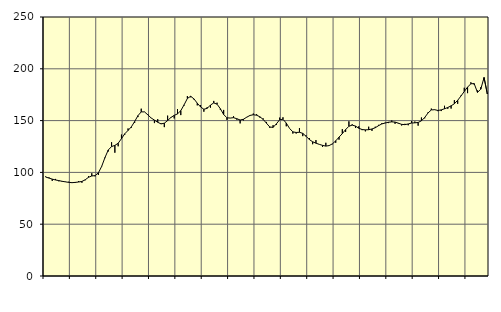
| Category | Piggar | Series 1 |
|---|---|---|
| nan | 96.1 | 95.5 |
| 87.0 | 95.2 | 94.53 |
| 87.0 | 91.8 | 93.51 |
| 87.0 | 93.7 | 92.68 |
| nan | 91.4 | 92.09 |
| 88.0 | 91 | 91.41 |
| 88.0 | 91.1 | 90.87 |
| 88.0 | 91 | 90.38 |
| nan | 90.3 | 90.08 |
| 89.0 | 89.8 | 90.36 |
| 89.0 | 91.6 | 90.73 |
| 89.0 | 90 | 91.27 |
| nan | 92.4 | 92.88 |
| 90.0 | 96.4 | 95.27 |
| 90.0 | 99.2 | 96.56 |
| 90.0 | 96.2 | 96.9 |
| nan | 97.5 | 99.55 |
| 91.0 | 106.2 | 105.83 |
| 91.0 | 113.8 | 114.34 |
| 91.0 | 120.2 | 121.65 |
| nan | 129.1 | 124.95 |
| 92.0 | 119 | 126.06 |
| 92.0 | 125.2 | 128.13 |
| 92.0 | 136.5 | 132.57 |
| nan | 136.4 | 137.27 |
| 93.0 | 142.4 | 140.51 |
| 93.0 | 143.2 | 143.98 |
| 93.0 | 147.7 | 149.12 |
| nan | 153.4 | 154.76 |
| 94.0 | 161.5 | 158.43 |
| 94.0 | 158.3 | 158.4 |
| 94.0 | 156.1 | 155.55 |
| nan | 152.4 | 152.54 |
| 95.0 | 147.6 | 150.48 |
| 95.0 | 151.4 | 148.42 |
| 95.0 | 147.3 | 146.8 |
| nan | 143.7 | 147.49 |
| 96.0 | 154.8 | 150.05 |
| 96.0 | 152.7 | 153.02 |
| 96.0 | 152.1 | 155.06 |
| nan | 161.1 | 156.48 |
| 97.0 | 155.3 | 159.59 |
| 97.0 | 164.5 | 165.21 |
| 97.0 | 173.7 | 171.36 |
| nan | 172.5 | 173.48 |
| 98.0 | 170.4 | 170.95 |
| 98.0 | 164.7 | 166.81 |
| 98.0 | 165 | 163.16 |
| nan | 158.6 | 160.98 |
| 99.0 | 163 | 161.79 |
| 99.0 | 162.5 | 165.01 |
| 99.0 | 169 | 167.05 |
| nan | 167.3 | 165.85 |
| 0.0 | 160.4 | 161.45 |
| 0.0 | 160.3 | 155.91 |
| 0.0 | 150.7 | 152.69 |
| nan | 152.5 | 152.46 |
| 1.0 | 154.2 | 152.82 |
| 1.0 | 150.9 | 151.81 |
| 1.0 | 147.3 | 150.58 |
| nan | 150.2 | 151.28 |
| 2.0 | 153.5 | 153.28 |
| 2.0 | 154.9 | 154.99 |
| 2.0 | 156.8 | 155.65 |
| nan | 156.2 | 155.21 |
| 3.0 | 152.9 | 153.66 |
| 3.0 | 152.1 | 151.13 |
| 3.0 | 148.7 | 147.42 |
| nan | 143 | 143.83 |
| 4.0 | 145.6 | 143.45 |
| 4.0 | 145.8 | 146.86 |
| 4.0 | 152.9 | 150.81 |
| nan | 153.2 | 151.33 |
| 5.0 | 144.5 | 147.61 |
| 5.0 | 142.5 | 142.45 |
| 5.0 | 137.5 | 139.13 |
| nan | 137.5 | 138.54 |
| 6.0 | 142.8 | 138.74 |
| 6.0 | 135 | 137.67 |
| 6.0 | 135.7 | 134.88 |
| nan | 133.1 | 131.7 |
| 7.0 | 127.2 | 129.56 |
| 7.0 | 131.2 | 128.21 |
| 7.0 | 127.1 | 127.08 |
| nan | 124.6 | 126.09 |
| 8.0 | 128.6 | 125.39 |
| 8.0 | 126.1 | 125.88 |
| 8.0 | 127.2 | 127.59 |
| nan | 128.6 | 130.44 |
| 9.0 | 131.6 | 134.05 |
| 9.0 | 141.7 | 137.4 |
| 9.0 | 139.1 | 141.31 |
| nan | 149.3 | 144.55 |
| 10.0 | 146.4 | 145.66 |
| 10.0 | 142.9 | 144.7 |
| 10.0 | 144.5 | 142.64 |
| nan | 140.8 | 141.38 |
| 11.0 | 139.6 | 141.06 |
| 11.0 | 144.1 | 141.22 |
| 11.0 | 140.1 | 141.92 |
| nan | 144.1 | 143.11 |
| 12.0 | 145.9 | 145.12 |
| 12.0 | 147.6 | 146.8 |
| 12.0 | 148 | 147.65 |
| nan | 147.6 | 148.42 |
| 13.0 | 150.1 | 148.78 |
| 13.0 | 146.9 | 148.56 |
| 13.0 | 147.1 | 147.52 |
| nan | 145.3 | 146.36 |
| 14.0 | 146.9 | 146.09 |
| 14.0 | 145.5 | 146.77 |
| 14.0 | 149.5 | 147.64 |
| nan | 149.1 | 147.84 |
| 15.0 | 145.1 | 148.2 |
| 15.0 | 153 | 149.79 |
| 15.0 | 152.2 | 153.03 |
| nan | 157.9 | 157.36 |
| 16.0 | 161.6 | 160.28 |
| 16.0 | 160.7 | 160.52 |
| 16.0 | 159.1 | 159.8 |
| nan | 159.2 | 160.35 |
| 17.0 | 164.3 | 161.43 |
| 17.0 | 161.4 | 162.64 |
| 17.0 | 161.6 | 164.26 |
| nan | 169.7 | 166.26 |
| 18.0 | 166.2 | 169.6 |
| 18.0 | 174.1 | 173.72 |
| 18.0 | 181.7 | 178.12 |
| nan | 176.5 | 182.33 |
| 19.0 | 187 | 185.53 |
| 19.0 | 184.7 | 185.73 |
| 19.0 | 179.1 | 177.23 |
| nan | 182.2 | 180.32 |
| 20.0 | 188.7 | 191.57 |
| 20.0 | 176.3 | 175.68 |